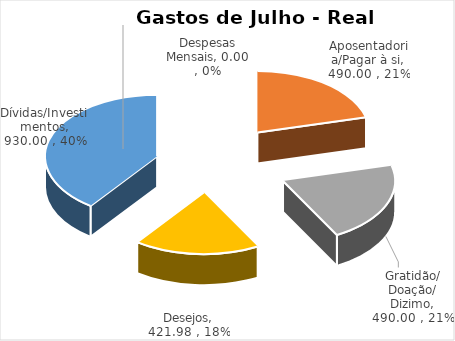
| Category | Gastos de Julho - Real Acumulado |
|---|---|
| Despesas Mensais | 0 |
| Aposentadoria/Pagar à si | 490 |
| Gratidão/ Doação/ Dizimo | 490 |
| Desejos | 421.98 |
| Dívidas/Investimentos | 930 |